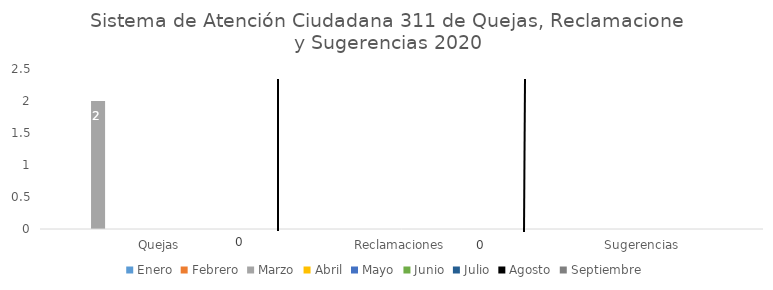
| Category | Enero | Febrero | Marzo | Abril | Mayo | Junio | Julio | Agosto | Septiembre | Octubre | Noviembre | Diciembre |
|---|---|---|---|---|---|---|---|---|---|---|---|---|
| Quejas | 0 | 0 | 2 | 0 | 0 | 0 | 0 | 0 | 0 | 0 | 0 | 0 |
| Reclamaciones | 0 | 0 | 0 | 0 | 0 | 0 | 0 | 0 | 0 | 0 | 0 | 0 |
| Sugerencias | 0 | 0 | 0 | 0 | 0 | 0 | 0 | 0 | 0 | 0 | 0 | 0 |